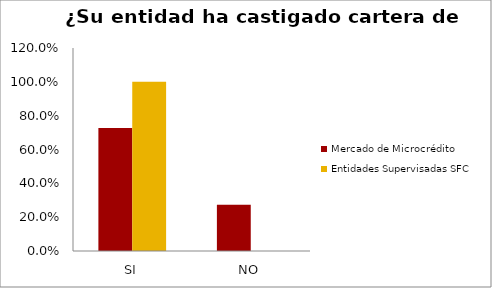
| Category | Mercado de Microcrédito | Entidades Supervisadas SFC |
|---|---|---|
| SI | 0.727 | 1 |
| NO | 0.273 | 0 |